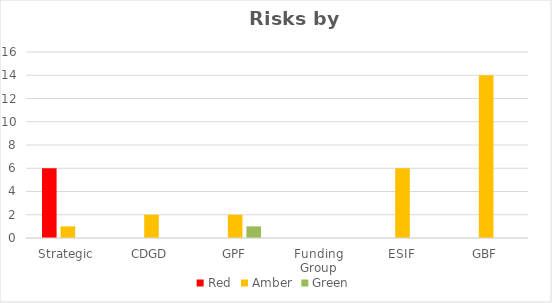
| Category | Red | Amber | Green |
|---|---|---|---|
| Strategic | 6 | 1 | 0 |
| CDGD | 0 | 2 | 0 |
| GPF | 0 | 2 | 1 |
| Funding Group | 0 | 0 | 0 |
| ESIF | 0 | 6 | 0 |
| GBF | 0 | 14 | 0 |